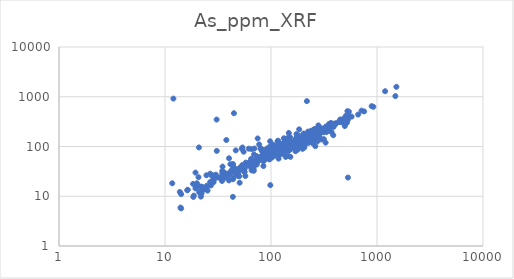
| Category | As_ppm_XRF |
|---|---|
| 518.8 | 369.6 |
| 664.0 | 438.93 |
| 274.2 | 126.529 |
| 261.8 | 101.632 |
| 193.2 | 120.115 |
| 157.3 | 98.65 |
| 125.4 | 86.6 |
| 50.6 | 18.706 |
| 169.7 | 134.926 |
| 112.5 | 80.385 |
| 115.8 | 80.015 |
| 208.6 | 128.301 |
| 405.8 | 279.993 |
| 87.3 | 55.028 |
| 142.6 | 110.662 |
| 23.3 | 13.606 |
| 526.9 | 373.197 |
| 1192.3 | 1291.1 |
| 133.0 | 87.23 |
| 352.3 | 283.523 |
| 220.7 | 126.478 |
| 36.5 | 28.228 |
| 28.7 | 21.078 |
| 30.3 | 25.086 |
| 47.7 | 32.876 |
| 304.7 | 197.65 |
| 84.8 | 40.472 |
| 94.2 | 67.349 |
| 205.9 | 131.814 |
| 195.4 | 152.879 |
| 280.9 | 163.012 |
| 173.4 | 148.493 |
| 220.6 | 139.815 |
| 110.2 | 81.042 |
| 50.2 | 25.279 |
| 293.5 | 186.096 |
| 205.5 | 176.598 |
| 317.9 | 217.595 |
| 117.8 | 56.994 |
| 49.0 | 31.077 |
| 21.5 | 15.748 |
| 40.1 | 20.811 |
| 35.5 | 25.397 |
| 26.7 | 19.375 |
| 49.8 | 33.787 |
| 126.2 | 71.22 |
| 142.1 | 85.063 |
| 36.0 | 25.422 |
| 64.0 | 39.5 |
| 24.3 | 14.411 |
| 153.9 | 96.796 |
| 137.6 | 86.09 |
| 114.4 | 84.225 |
| 153.2 | 93.62 |
| 151.8 | 100.98 |
| 34.9 | 25.469 |
| 98.0 | 63.747 |
| 102.0 | 67.02 |
| 121.5 | 86.098 |
| 65.0 | 51.836 |
| 101.4 | 102.513 |
| 159.1 | 97.263 |
| 117.5 | 88.512 |
| 95.9 | 82.968 |
| 104.0 | 88.658 |
| 55.2 | 78.602 |
| 96.3 | 55.034 |
| 30.8 | 81.617 |
| 198.8 | 113.917 |
| 137.6 | 130.563 |
| 156.9 | 97.499 |
| 123.6 | 100.401 |
| 40.8 | 30.236 |
| 100.8 | 90.536 |
| 122.9 | 82.643 |
| 65.7 | 88.38 |
| 178.4 | 125.363 |
| 110.8 | 89.166 |
| 174.9 | 93.671 |
| 225.4 | 151.646 |
| 254.6 | 158.334 |
| 118.0 | 81.643 |
| 119.5 | 69.905 |
| 148.0 | 87.379 |
| 104.1 | 85.713 |
| 140.2 | 105.039 |
| 83.0 | 78.63 |
| 134.0 | 78.651 |
| 154.4 | 107.22 |
| 114.4 | 77.851 |
| 25.2 | 12.988 |
| 213.7 | 156.551 |
| 148.4 | 110.775 |
| 165.7 | 123.899 |
| 29.6 | 23.024 |
| 133.6 | 91.263 |
| 107.8 | 65.293 |
| 115.9 | 80.415 |
| 112.6 | 89.454 |
| 139.3 | 98.538 |
| 91.4 | 90.277 |
| 127.9 | 79.768 |
| 106.0 | 90.181 |
| 323.1 | 221.317 |
| 390.0 | 263.02 |
| 134.0 | 123.342 |
| 120.4 | 100.853 |
| 35.4 | 24.445 |
| 125.6 | 95.204 |
| 521.0 | 302.24 |
| 126.0 | 71.935 |
| 154.5 | 92.616 |
| 98.1 | 127.469 |
| 121.7 | 91.496 |
| 75.5 | 55.962 |
| 149.6 | 100.225 |
| 22.1 | 11.302 |
| 83.7 | 63.423 |
| 43.8 | 21.988 |
| 29.7 | 24.509 |
| 194.8 | 135.963 |
| 218.0 | 816.486 |
| 119.5 | 86.676 |
| 151.4 | 112.868 |
| 100.0 | 84.606 |
| 140.0 | 97.793 |
| 141.3 | 114.323 |
| 147.3 | 187.014 |
| 151.8 | 96.072 |
| 182.7 | 165.258 |
| 172.0 | 142.128 |
| 145.4 | 104.772 |
| 148.0 | 113.227 |
| 122.5 | 84.542 |
| 240.9 | 159.954 |
| 124.1 | 104.142 |
| 176.8 | 149.27 |
| 98.1 | 56.71 |
| 99.5 | 71.967 |
| 140.8 | 100.206 |
| 117.6 | 98.304 |
| 221.9 | 176.406 |
| 254.7 | 159.012 |
| 77.4 | 109.841 |
| 115.4 | 90.751 |
| 129.0 | 83.458 |
| 87.3 | 68.524 |
| 36.6 | 29.581 |
| 199.9 | 151.35 |
| 192.8 | 132.027 |
| 178.8 | 119.359 |
| 98.3 | 81.066 |
| 69.1 | 68.981 |
| 50.9 | 37.551 |
| 102.7 | 68.579 |
| 102.5 | 64.533 |
| 90.3 | 63.998 |
| 144.2 | 65.502 |
| 251.4 | 215.786 |
| 287.0 | 215.013 |
| 285.9 | 215.561 |
| 280.0 | 265.702 |
| 120.4 | 96.892 |
| 110.8 | 101.007 |
| 154.5 | 118.169 |
| 100.8 | 82.005 |
| 387.0 | 285.896 |
| 367.8 | 297.311 |
| 375.7 | 261.701 |
| 173.9 | 177.392 |
| 150.9 | 111.701 |
| 151.8 | 103.382 |
| 166.8 | 121.206 |
| 118.9 | 94.5 |
| 289.3 | 219.103 |
| 172.6 | 115.229 |
| 148.8 | 96.537 |
| 114.1 | 85.059 |
| 123.4 | 104.372 |
| 168.3 | 126.691 |
| 155.8 | 99.688 |
| 239.2 | 207.155 |
| 108.4 | 73.134 |
| 95.6 | 56.976 |
| 98.9 | 70.247 |
| 134.2 | 110.905 |
| 158.9 | 111.413 |
| 251.9 | 191.616 |
| 178.2 | 86.424 |
| 100.4 | 68.805 |
| 109.2 | 81.107 |
| 54.8 | 35.704 |
| 118.5 | 76.679 |
| 79.7 | 90.252 |
| 206.8 | 176.841 |
| 61.8 | 45.74 |
| 65.3 | 41.623 |
| 67.1 | 44.327 |
| 101.6 | 59.706 |
| 70.9 | 43.322 |
| 84.8 | 50.233 |
| 48.5 | 25.67 |
| 43.8 | 44.351 |
| 22.4 | 15.467 |
| 28.6 | 21.094 |
| 82.1 | 57.955 |
| 64.9 | 56.231 |
| 44.3 | 38.648 |
| 84.5 | 58.845 |
| 170.3 | 80.147 |
| 195.7 | 134.844 |
| 57.3 | 25.504 |
| 40.2 | 57.993 |
| 74.8 | 145.181 |
| 211.7 | 133.925 |
| 221.4 | 161.162 |
| 113.7 | 83.51 |
| 124.2 | 98.182 |
| 191.8 | 123.294 |
| 129.9 | 82.618 |
| 263.9 | 193.134 |
| 138.7 | 84.844 |
| 166.7 | 102.796 |
| 313.9 | 193.168 |
| 253.0 | 166.56 |
| 204.6 | 131.081 |
| 196.2 | 146.605 |
| 134.3 | 90.179 |
| 471.6 | 306.828 |
| 172.2 | 105.222 |
| 119.0 | 82.233 |
| 258.4 | 172.704 |
| 196.0 | 147.568 |
| 139.8 | 100.281 |
| 133.8 | 97.524 |
| 273.8 | 156.85 |
| 235.5 | 123.669 |
| 146.4 | 99.597 |
| 108.3 | 89.549 |
| 225.8 | 118.772 |
| 211.9 | 128.984 |
| 158.0 | 105.471 |
| 115.6 | 74.008 |
| 145.3 | 114.173 |
| 145.5 | 82.151 |
| 153.8 | 96.39 |
| 134.4 | 90.04 |
| 107.3 | 71.352 |
| 109.0 | 88.304 |
| 116.2 | 70.654 |
| 109.2 | 68.187 |
| 93.4 | 73.214 |
| 75.4 | 51.985 |
| 64.9 | 44.503 |
| 44.5 | 33.378 |
| 56.2 | 30.545 |
| 34.5 | 20.293 |
| 53.8 | 95.414 |
| 87.8 | 55.711 |
| 30.2 | 27.115 |
| 32.1 | 23.647 |
| 39.0 | 25.741 |
| 137.8 | 61.711 |
| 85.1 | 57.932 |
| 28.5 | 24.36 |
| 54.7 | 33.452 |
| 57.8 | 47.514 |
| 85.1 | 66.288 |
| 158.6 | 95.648 |
| 139.9 | 144.211 |
| 159.4 | 125.831 |
| 129.8 | 100.164 |
| 140.3 | 107.199 |
| 127.3 | 85.37 |
| 214.4 | 115.217 |
| 131.9 | 109.86 |
| 101.7 | 78.843 |
| 106.3 | 82.052 |
| 143.6 | 112.487 |
| 124.9 | 86.261 |
| 388.9 | 247.814 |
| 237.3 | 182.272 |
| 183.0 | 124.564 |
| 223.9 | 199.363 |
| 328.8 | 250.866 |
| 444.9 | 311.316 |
| 201.6 | 128.29 |
| 138.1 | 114.417 |
| 164.2 | 99.598 |
| 265.2 | 204.595 |
| 197.4 | 142.342 |
| 203.6 | 153.271 |
| 96.4 | 97.838 |
| 96.8 | 78.295 |
| 159.6 | 117.708 |
| 130.7 | 80.65 |
| 93.2 | 83.382 |
| 88.3 | 81.377 |
| 105.1 | 79.505 |
| 108.2 | 72.193 |
| 92.0 | 64.427 |
| 85.7 | 82.964 |
| 73.4 | 43.378 |
| 103.8 | 78.637 |
| 127.9 | 84.835 |
| 117.1 | 82.1 |
| 100.6 | 88.146 |
| 144.2 | 91.739 |
| 118.7 | 121.763 |
| 81.2 | 64.418 |
| 266.2 | 217.136 |
| 923.0 | 627.696 |
| 106.5 | 83.199 |
| 75.6 | 50.15 |
| 34.9 | 39.45 |
| 34.7 | 32.174 |
| 61.5 | 46.877 |
| 44.6 | 36.054 |
| 152.1 | 114.944 |
| 117.1 | 90.096 |
| 34.7 | 28.788 |
| 35.3 | 30.838 |
| 124.5 | 107.368 |
| 133.5 | 122.618 |
| 120.1 | 89.504 |
| 81.9 | 82.519 |
| 175.9 | 152.354 |
| 143.6 | 96.658 |
| 149.2 | 109.524 |
| 259.1 | 224.793 |
| 149.6 | 94.923 |
| 123.4 | 109.784 |
| 204.7 | 99.941 |
| 344.0 | 234.776 |
| 253.9 | 129.876 |
| 198.5 | 89.718 |
| 206.1 | 127.331 |
| 409.6 | 294.74 |
| 450.0 | 349.746 |
| 103.6 | 94.631 |
| 526.1 | 512.786 |
| 284.4 | 238.033 |
| 98.7 | 86.148 |
| 115.0 | 79.192 |
| 142.2 | 108.898 |
| 94.0 | 69.935 |
| 64.8 | 49.727 |
| 144.9 | 106.299 |
| 53.6 | 42.38 |
| 116.6 | 98.465 |
| 104.8 | 79.517 |
| 73.3 | 64.031 |
| 122.7 | 102.369 |
| 98.4 | 81.31 |
| 43.3 | 31.474 |
| 60.4 | 41.85 |
| 208.2 | 142.704 |
| 41.5 | 29.556 |
| 40.3 | 27.496 |
| 26.7 | 28.426 |
| 19.4 | 29.892 |
| 184.4 | 221.136 |
| 135.1 | 116.526 |
| 183.8 | 134.777 |
| 239.5 | 189.555 |
| 186.6 | 101.808 |
| 196.6 | 143.316 |
| 132.1 | 146.076 |
| 202.6 | 181.912 |
| 173.7 | 113.571 |
| 185.7 | 122.48 |
| 355.3 | 239.17 |
| 206.6 | 150.052 |
| 518.0 | 386.457 |
| 715.3 | 524.638 |
| 444.4 | 329.275 |
| 450.7 | 308.459 |
| 1523.1 | 1582.624 |
| 533.3 | 379.565 |
| 102.0 | 78.311 |
| 115.4 | 125.909 |
| 158.5 | 111.757 |
| 35.5 | 28.059 |
| 98.5 | 95.869 |
| 109.3 | 95.733 |
| 140.4 | 86.026 |
| 223.3 | 157.426 |
| 128.9 | 109.45 |
| 145.0 | 112.99 |
| 100.5 | 91.435 |
| 116.4 | 130.64 |
| 159.7 | 111.234 |
| 108.0 | 87.939 |
| 372.9 | 194.163 |
| 124.9 | 96.587 |
| 314.9 | 140.718 |
| 119.1 | 90.858 |
| 298.9 | 232.078 |
| 539.1 | 403.782 |
| 263.0 | 208.523 |
| 274.7 | 205.944 |
| 542.8 | 501.344 |
| 153.5 | 115.286 |
| 115.6 | 82.369 |
| 49.0 | 28.473 |
| 99.0 | 72.793 |
| 24.8 | 16.291 |
| 56.2 | 31.073 |
| 155.3 | 95.93 |
| 153.8 | 101.423 |
| 184.4 | 147.821 |
| 148.6 | 101.488 |
| 131.5 | 96.662 |
| 333.6 | 245.646 |
| 151.1 | 155.091 |
| 326.5 | 231.397 |
| 508.6 | 413.444 |
| 123.9 | 101.896 |
| 69.7 | 52.081 |
| 118.5 | 83.207 |
| 95.9 | 82.447 |
| 136.5 | 88.288 |
| 61.7 | 90.478 |
| 109.1 | 79.488 |
| 87.1 | 79.846 |
| 175.8 | 112.518 |
| 136.4 | 89.842 |
| 266.1 | 165.722 |
| 142.6 | 93.25 |
| 145.0 | 125.047 |
| 143.3 | 103.811 |
| 497.3 | 257.772 |
| 529.6 | 341.347 |
| 356.0 | 217.595 |
| 140.0 | 101.355 |
| 91.7 | 82.149 |
| 155.6 | 111.83 |
| 16.4 | 13.47 |
| 37.0 | 24.634 |
| 104.6 | 78.789 |
| 99.0 | 79.876 |
| 148.3 | 114.222 |
| 149.6 | 84.671 |
| 132.0 | 81.409 |
| 35.9 | 22.795 |
| 24.6 | 26.359 |
| 128.2 | 104.697 |
| 515.2 | 321.298 |
| 132.7 | 94.767 |
| 150.2 | 108.089 |
| 207.2 | 152.934 |
| 313.6 | 215.986 |
| 576.3 | 398.349 |
| 214.2 | 160.978 |
| 162.8 | 126.294 |
| 104.0 | 84.556 |
| 755.6 | 507.403 |
| 105.7 | 81.846 |
| 185.3 | 117.018 |
| 110.5 | 90.438 |
| 99.4 | 90.948 |
| 104.4 | 108.67 |
| 137.8 | 95.998 |
| 178.6 | 130.506 |
| 193.5 | 146.543 |
| 386.6 | 168.702 |
| 250.4 | 160.681 |
| 334.5 | 194.711 |
| 178.4 | 129.84 |
| 555.0 | 399.204 |
| 126.3 | 94.236 |
| 101.1 | 79.742 |
| 203.4 | 126.68 |
| 336.6 | 204.447 |
| 206.5 | 95.55 |
| 30.7 | 348.011 |
| 293.9 | 211.731 |
| 34.0 | 24.111 |
| 18.5 | 9.686 |
| 18.4 | 17.687 |
| 531.8 | 23.747 |
| 1490.1 | 1030.803 |
| 163.8 | 101.462 |
| 212.6 | 162.402 |
| 146.9 | 152.503 |
| 20.0 | 18.228 |
| 11.7 | 18.23 |
| 152.4 | 61.95 |
| 18.7 | 10.292 |
| 36.1 | 27.73 |
| 14.2 | 11.052 |
| 21.8 | 12.465 |
| 28.5 | 26.207 |
| 42.7 | 33.785 |
| 43.3 | 33.26 |
| 82.5 | 83.921 |
| 46.5 | 29.164 |
| 46.1 | 34.069 |
| 35.6 | 24.296 |
| 16.2 | 13.229 |
| 28.7 | 19.066 |
| 27.1 | 16.495 |
| 43.7 | 9.726 |
| 63.1 | 40.96 |
| 113.5 | 88.479 |
| 53.0 | 89.925 |
| 130.6 | 109.871 |
| 159.4 | 107.49 |
| 68.8 | 51.725 |
| 19.9 | 16.579 |
| 44.7 | 38.015 |
| 24.6 | 13.891 |
| 19.4 | 14.393 |
| 96.6 | 79.686 |
| 45.4 | 30.181 |
| 68.5 | 35.8 |
| 43.9 | 23.636 |
| 14.0 | 5.924 |
| 44.7 | 466.342 |
| 24.6 | 14.398 |
| 14.2 | 5.706 |
| 21.8 | 9.835 |
| 27.6 | 25.833 |
| 19.7 | 14.725 |
| 56.5 | 36.08 |
| 68.8 | 32.525 |
| 34.2 | 24.239 |
| 41.4 | 44.126 |
| 38.8 | 27.724 |
| 120.1 | 101.332 |
| 327.4 | 119.658 |
| 108.5 | 80.816 |
| 95.7 | 77.879 |
| 299.2 | 138.542 |
| 890.7 | 646.957 |
| 258.8 | 169.679 |
| 65.6 | 33.185 |
| 264.0 | 180.282 |
| 231.1 | 166.317 |
| 269.7 | 156.206 |
| 123.4 | 103.829 |
| 108.9 | 79.191 |
| 93.9 | 78.956 |
| 46.5 | 83.552 |
| 20.7 | 24.172 |
| 246.7 | 116.863 |
| 147.5 | 140.514 |
| 235.9 | 155.199 |
| 239.8 | 195.021 |
| 256.7 | 220.847 |
| 128.5 | 106.749 |
| 193.4 | 100.485 |
| 230.9 | 161.65 |
| 190.5 | 125.931 |
| 178.2 | 99.95 |
| 123.5 | 95.739 |
| 213.3 | 169.041 |
| 483.6 | 363.191 |
| 107.6 | 85.671 |
| 138.1 | 109.599 |
| 143.2 | 85.503 |
| 253.5 | 133.109 |
| 141.5 | 114.767 |
| 284.4 | 154.804 |
| 145.0 | 98.258 |
| 174.9 | 144.3 |
| 103.6 | 78.112 |
| 283.5 | 181.284 |
| 246.5 | 151.947 |
| 243.9 | 135.715 |
| 142.6 | 92.416 |
| 71.9 | 50.863 |
| 150.8 | 107.712 |
| 186.7 | 119.889 |
| 69.8 | 90.934 |
| 97.7 | 74.102 |
| 130.4 | 96.821 |
| 138.2 | 91.288 |
| 133.6 | 81.736 |
| 81.3 | 89.043 |
| 20.9 | 95.696 |
| 12.0 | 918.024 |
| 51.8 | 37.442 |
| 153.9 | 117.655 |
| 13.8 | 12.202 |
| 37.9 | 134.901 |
| 21.0 | 11.999 |
| 180.4 | 135.478 |
| 151.6 | 103.979 |
| 98.5 | 16.732 |